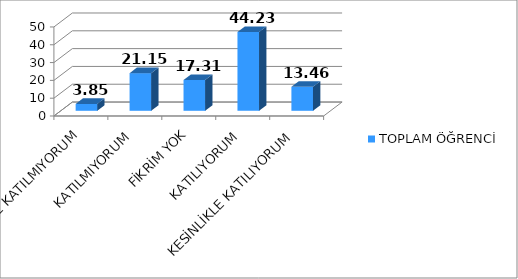
| Category | TOPLAM ÖĞRENCİ |
|---|---|
| KESİNLİKLE KATILMIYORUM | 3.85 |
| KATILMIYORUM | 21.15 |
| FİKRİM YOK | 17.31 |
| KATILIYORUM | 44.23 |
| KESİNLİKLE KATILIYORUM | 13.46 |